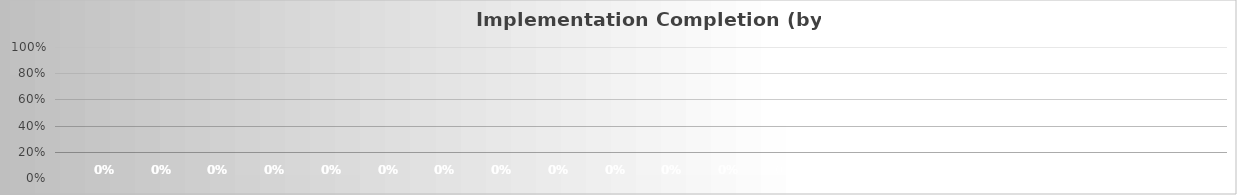
| Category | Series 1 | Series 2 | Series 3 | Series 4 | Series 5 | Series 6 | Series 7 | Series 8 | Series 9 | Series 10 | Series 11 | Series 12 | Series 13 | Series 14 | Series 15 | Series 16 | Series 17 | Series 18 | Series 19 | Series 0 |
|---|---|---|---|---|---|---|---|---|---|---|---|---|---|---|---|---|---|---|---|---|
| All Controls Implemented: | 0 | 0 | 0 | 0 | 0 | 0 | 0 | 0 | 0 | 0 | 0 | 0 | 0 | 0 | 0 | 0 | 0 | 0 | 0 | 0 |